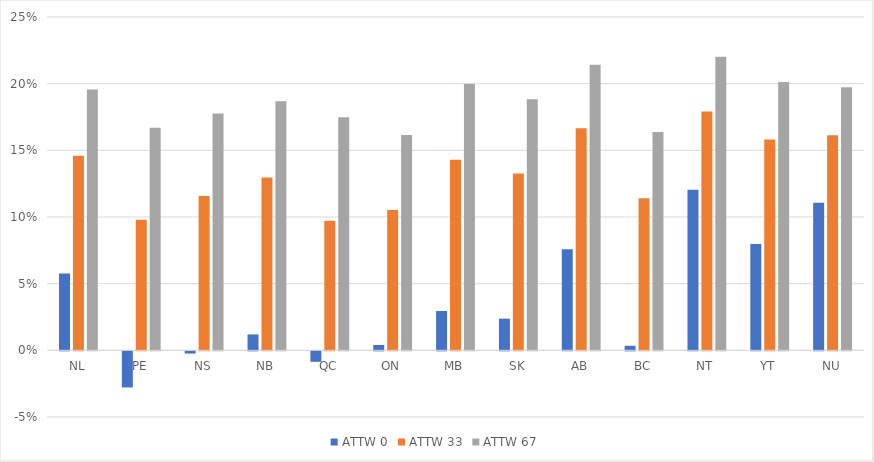
| Category | ATTW 0 | ATTW 33 | ATTW 67 |
|---|---|---|---|
| NL | 0.058 | 0.146 | 0.196 |
| PE | -0.027 | 0.098 | 0.167 |
| NS | -0.002 | 0.116 | 0.178 |
| NB | 0.012 | 0.13 | 0.187 |
| QC | -0.008 | 0.097 | 0.175 |
| ON | 0.004 | 0.105 | 0.162 |
| MB | 0.03 | 0.143 | 0.2 |
| SK | 0.024 | 0.133 | 0.188 |
| AB | 0.076 | 0.166 | 0.214 |
| BC | 0.003 | 0.114 | 0.164 |
| NT | 0.12 | 0.179 | 0.22 |
| YT | 0.08 | 0.158 | 0.201 |
| NU | 0.111 | 0.161 | 0.197 |